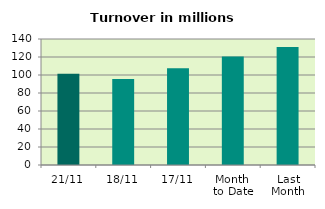
| Category | Series 0 |
|---|---|
| 21/11 | 101.499 |
| 18/11 | 95.658 |
| 17/11 | 107.538 |
| Month 
to Date | 120.657 |
| Last
Month | 131.017 |